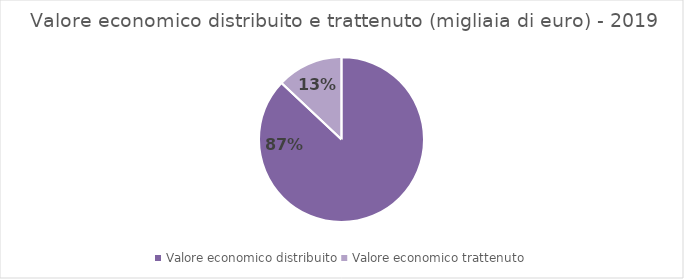
| Category | Series 0 |
|---|---|
| Valore economico distribuito | 2338379 |
| Valore economico trattenuto | 348743 |